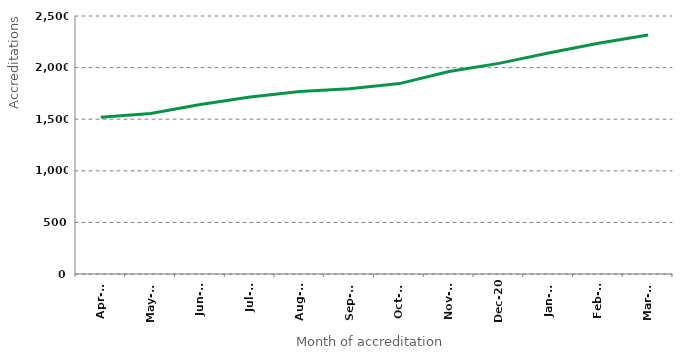
| Category | Series 0 |
|---|---|
| Apr-20 | 1520 |
| May-20 | 1555 |
| Jun-20 | 1642 |
| Jul-20 | 1716 |
| Aug-20 | 1768 |
| Sep-20 | 1795 |
| Oct-20 | 1845 |
| Nov-20 | 1962 |
| Dec-20 | 2041 |
| Jan-21 | 2141 |
| Feb-21 | 2236 |
| Mar-21 | 2316 |